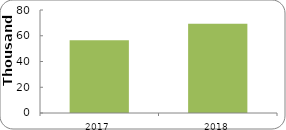
| Category | CERTIFICACIÓN DE COMPETENCIAS |
|---|---|
| 2017.0 | 56526 |
| 2018.0 | 69287 |